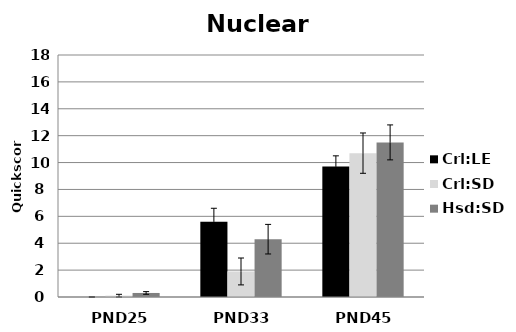
| Category | Crl:LE | Crl:SD | Hsd:SD |
|---|---|---|---|
| PND25 | 0 | 0.1 | 0.3 |
| PND33 | 5.6 | 1.9 | 4.3 |
| PND45 | 9.7 | 10.7 | 11.5 |